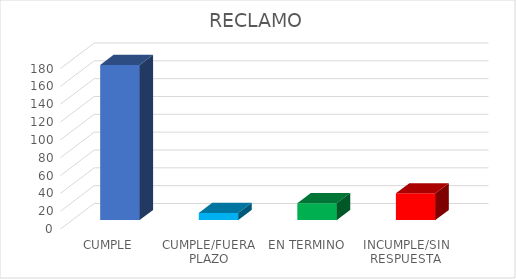
| Category | TOTAL |
|---|---|
| CUMPLE | 174 |
| CUMPLE/FUERA PLAZO | 8 |
| EN TERMINO | 19 |
| INCUMPLE/SIN RESPUESTA | 30 |